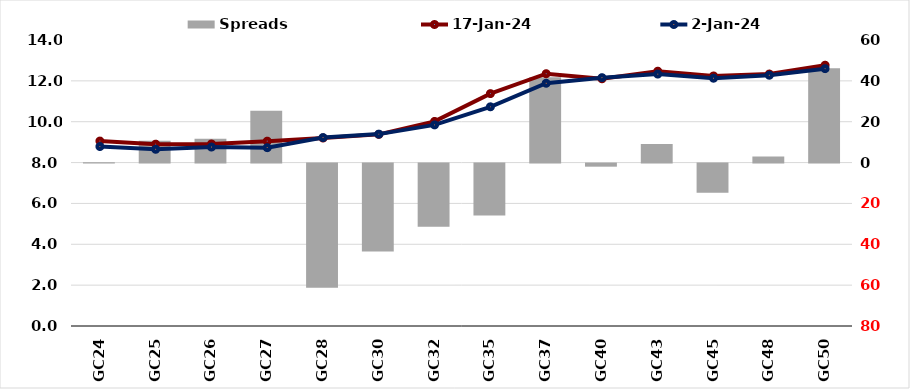
| Category |  Spreads   |
|---|---|
| GC24 | 0.148 |
| GC25 | 10.683 |
| GC26 | 11.616 |
| GC27 | 25.421 |
| GC28 | -60.753 |
| GC30 | -43.045 |
| GC32 | -30.912 |
| GC35 | -25.466 |
| GC37 | 41.827 |
| GC40 | -1.518 |
| GC43 | 9.048 |
| GC45 | -14.255 |
| GC48 | 3.01 |
| GC50 | 46.118 |